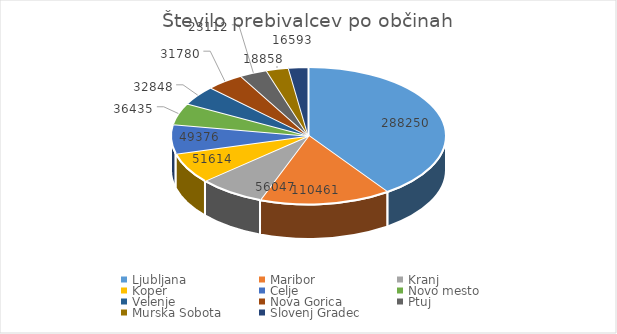
| Category | Series 0 |
|---|---|
| Ljubljana | 288250 |
| Maribor | 110461 |
| Kranj | 56047 |
| Koper | 51614 |
| Celje | 49376 |
| Novo mesto | 36435 |
| Velenje | 32848 |
| Nova Gorica | 31780 |
| Ptuj | 23112 |
| Murska Sobota | 18858 |
| Slovenj Gradec | 16593 |